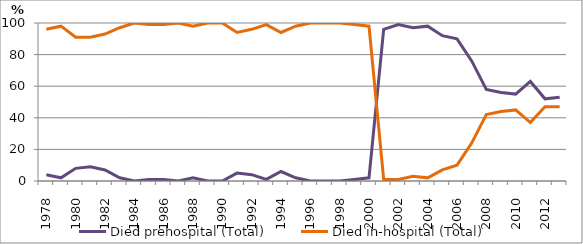
| Category | Died prehospital (Total) | Died in-hospital (Total) |
|---|---|---|
| 1978.0 | 4 | 96 |
| 1979.0 | 2 | 98 |
| 1980.0 | 8 | 91 |
| 1981.0 | 9 | 91 |
| 1982.0 | 7 | 93 |
| 1983.0 | 2 | 97 |
| 1984.0 | 0 | 100 |
| 1985.0 | 1 | 99 |
| 1986.0 | 1 | 99 |
| 1987.0 | 0 | 100 |
| 1988.0 | 2 | 98 |
| 1989.0 | 0 | 100 |
| 1990.0 | 0 | 100 |
| 1991.0 | 5 | 94 |
| 1992.0 | 4 | 96 |
| 1993.0 | 1 | 99 |
| 1994.0 | 6 | 94 |
| 1995.0 | 2 | 98 |
| 1996.0 | 0 | 100 |
| 1997.0 | 0 | 100 |
| 1998.0 | 0 | 100 |
| 1999.0 | 1 | 99 |
| 2000.0 | 2 | 98 |
| 2001.0 | 96 | 1 |
| 2002.0 | 99 | 1 |
| 2003.0 | 97 | 3 |
| 2004.0 | 98 | 2 |
| 2005.0 | 92 | 7 |
| 2006.0 | 90 | 10 |
| 2007.0 | 76 | 24 |
| 2008.0 | 58 | 42 |
| 2009.0 | 56 | 44 |
| 2010.0 | 55 | 45 |
| 2011.0 | 63 | 37 |
| 2012.0 | 52 | 47 |
| 2013.0 | 53 | 47 |